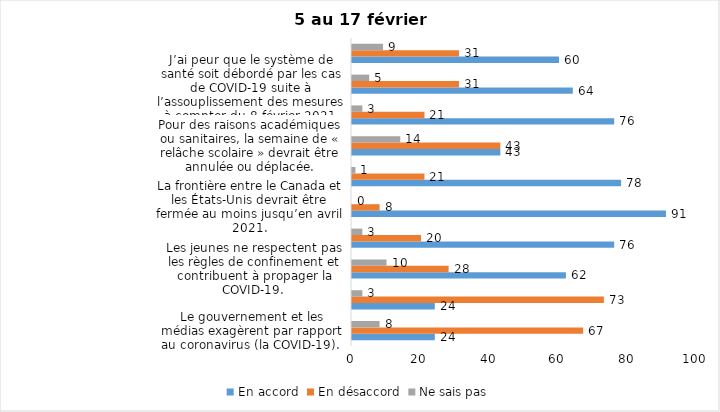
| Category | En accord | En désaccord | Ne sais pas |
|---|---|---|---|
| Le gouvernement et les médias exagèrent par rapport au coronavirus (la COVID-19). | 24 | 67 | 8 |
| Il est exagéré de rester chez soi pour se protéger contre le coronavirus (la COVID-19). | 24 | 73 | 3 |
| Les jeunes ne respectent pas les règles de confinement et contribuent à propager la COVID-19. | 62 | 28 | 10 |
| C’est une bonne chose que les policiers puissent donner facilement des contraventions aux gens qui ne respectent pas les mesures pour prévenir le coronavirus (la COVID-19). | 76 | 20 | 3 |
| La frontière entre le Canada et les États-Unis devrait être fermée au moins jusqu’en avril 2021. | 91 | 8 | 0 |
| Je suis favorable au port du masque ou du couvre-visage dans les
lieux publics extérieurs achalandés (ex. rues, parcs) | 78 | 21 | 1 |
| Pour des raisons académiques ou sanitaires, la semaine de « relâche scolaire » devrait être annulée ou déplacée. | 43 | 43 | 14 |
| C’est une bonne chose de rouvrir les services et commerces non essentiels (salons de coiffure, magasins, musée, industries) à partir du 8 février 2021. | 76 | 21 | 3 |
| J’ai peur que le système de santé soit débordé par les cas de COVID-19 suite à l’assouplissement des mesures à compter du 8 février 2021. | 64 | 31 | 5 |
| J’ai peur que la reprise des cours en présentiel dans les cégeps et les universités génère une augmentation des cas de COVID-19. | 60 | 31 | 9 |